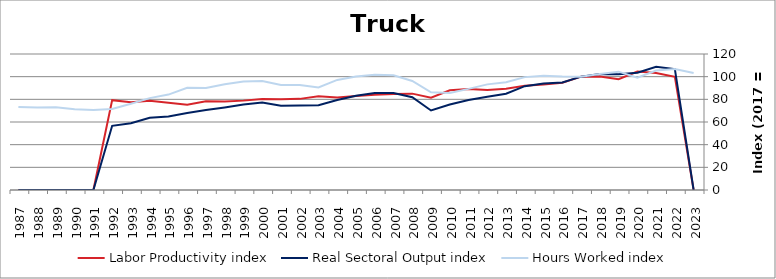
| Category | Labor Productivity index | Real Sectoral Output index | Hours Worked index |
|---|---|---|---|
| 2023.0 | 0 | 0 | 103.188 |
| 2022.0 | 99.901 | 106.666 | 106.771 |
| 2021.0 | 103.223 | 108.773 | 105.376 |
| 2020.0 | 104.577 | 103.537 | 99.005 |
| 2019.0 | 97.716 | 102.031 | 104.416 |
| 2018.0 | 100.097 | 102.399 | 102.3 |
| 2017.0 | 100 | 100 | 100 |
| 2016.0 | 94.643 | 94.81 | 100.176 |
| 2015.0 | 93.178 | 94.025 | 100.909 |
| 2014.0 | 92 | 91.631 | 99.599 |
| 2013.0 | 89.387 | 84.945 | 95.03 |
| 2012.0 | 88.297 | 82.288 | 93.195 |
| 2011.0 | 89.034 | 79.426 | 89.208 |
| 2010.0 | 87.994 | 75.386 | 85.672 |
| 2009.0 | 81.44 | 70.163 | 86.153 |
| 2008.0 | 85.031 | 81.812 | 96.214 |
| 2007.0 | 84.63 | 85.649 | 101.204 |
| 2006.0 | 84.093 | 85.482 | 101.651 |
| 2005.0 | 83.049 | 83.229 | 100.217 |
| 2004.0 | 81.676 | 79.347 | 97.148 |
| 2003.0 | 82.751 | 74.866 | 90.471 |
| 2002.0 | 80.411 | 74.503 | 92.653 |
| 2001.0 | 80.126 | 74.287 | 92.713 |
| 2000.0 | 80.236 | 77.226 | 96.249 |
| 1999.0 | 78.86 | 75.487 | 95.723 |
| 1998.0 | 78.12 | 72.836 | 93.236 |
| 1997.0 | 78.402 | 70.52 | 89.946 |
| 1996.0 | 75.292 | 67.862 | 90.132 |
| 1995.0 | 77.025 | 64.844 | 84.186 |
| 1994.0 | 78.665 | 63.765 | 81.059 |
| 1993.0 | 77.466 | 58.98 | 76.137 |
| 1992.0 | 79.278 | 56.668 | 71.48 |
| 1991.0 | 0 | 0 | 70.696 |
| 1990.0 | 0 | 0 | 71.324 |
| 1989.0 | 0 | 0 | 72.904 |
| 1988.0 | 0 | 0 | 72.69 |
| 1987.0 | 0 | 0 | 73.208 |